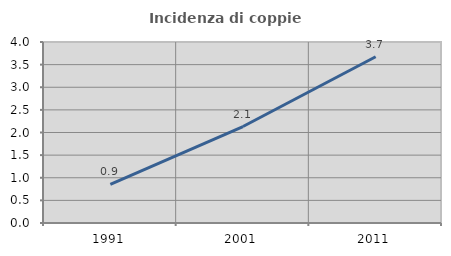
| Category | Incidenza di coppie miste |
|---|---|
| 1991.0 | 0.854 |
| 2001.0 | 2.132 |
| 2011.0 | 3.675 |